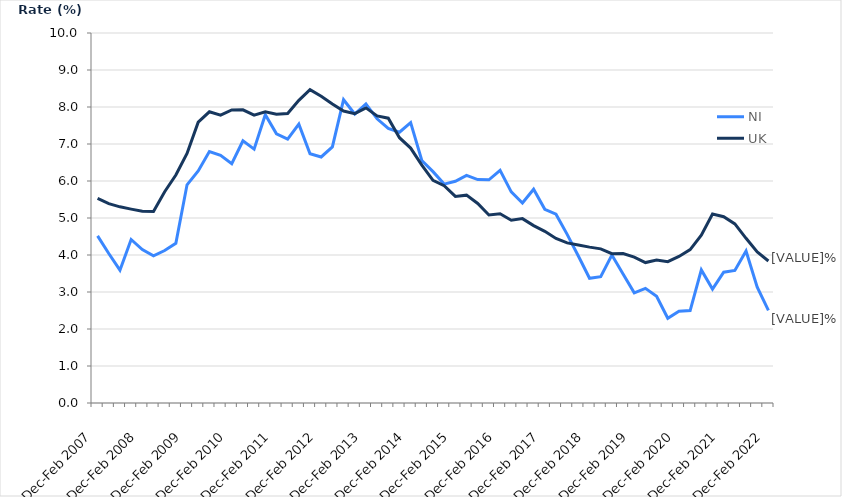
| Category | NI | UK |
|---|---|---|
| Dec-Feb 2007 | 4.516 | 5.53 |
| Mar-May 2007 | 4.04 | 5.389 |
| Jun-Aug 2007 | 3.589 | 5.302 |
| Sep-Nov 2007 | 4.419 | 5.239 |
| Dec-Feb 2008 | 4.146 | 5.181 |
| Mar-May 2008 | 3.979 | 5.179 |
| Jun-Aug 2008 | 4.122 | 5.71 |
| Sep-Nov 2008 | 4.317 | 6.163 |
| Dec-Feb 2009 | 5.897 | 6.744 |
| Mar-May 2009 | 6.27 | 7.59 |
| Jun-Aug 2009 | 6.796 | 7.87 |
| Sep-Nov 2009 | 6.693 | 7.781 |
| Dec-Feb 2010 | 6.47 | 7.92 |
| Mar-May 2010 | 7.085 | 7.923 |
| Jun-Aug 2010 | 6.862 | 7.782 |
| Sep-Nov 2010 | 7.791 | 7.871 |
| Dec-Feb 2011 | 7.277 | 7.803 |
| Mar-May 2011 | 7.133 | 7.822 |
| Jun-Aug 2011 | 7.538 | 8.181 |
| Sep-Nov 2011 | 6.736 | 8.467 |
| Dec-Feb 2012 | 6.65 | 8.289 |
| Mar-May 2012 | 6.922 | 8.08 |
| Jun-Aug 2012 | 8.196 | 7.89 |
| Sep-Nov 2012 | 7.81 | 7.82 |
| Dec-Feb 2013 | 8.083 | 7.976 |
| Mar-May 2013 | 7.68 | 7.758 |
| Jun-Aug 2013 | 7.422 | 7.698 |
| Sep-Nov 2013 | 7.318 | 7.17 |
| Dec-Feb 2014 | 7.578 | 6.889 |
| Mar-May 2014 | 6.554 | 6.428 |
| Jun-Aug 2014 | 6.253 | 6.019 |
| Sep-Nov 2014 | 5.916 | 5.871 |
| Dec-Feb 2015 | 5.991 | 5.583 |
| Mar-May 2015 | 6.154 | 5.617 |
| Jun-Aug 2015 | 6.039 | 5.392 |
| Sep-Nov 2015 | 6.033 | 5.081 |
| Dec-Feb 2016 | 6.288 | 5.113 |
| Mar-May 2016 | 5.706 | 4.939 |
| Jun-Aug 2016 | 5.404 | 4.983 |
| Sep-Nov 2016 | 5.778 | 4.794 |
| Dec-Feb 2017 | 5.235 | 4.64 |
| Mar-May 2017 | 5.102 | 4.445 |
| Jun-Aug 2017 | 4.558 | 4.328 |
| Sep-Nov 2017 | 3.974 | 4.272 |
| Dec-Feb 2018 | 3.371 | 4.213 |
| Mar-May 2018 | 3.416 | 4.165 |
| Jun-Aug 2018 | 3.999 | 4.035 |
| Sep-Nov 2018 | 3.486 | 4.039 |
| Dec-Feb 2019 | 2.979 | 3.942 |
| Mar-May 2019 | 3.099 | 3.796 |
| Jun-Aug 2019 | 2.886 | 3.863 |
| Sep-Nov 2019 | 2.289 | 3.819 |
| Dec-Feb 2020 | 2.483 | 3.961 |
| Mar-May 2020 | 2.498 | 4.147 |
| Jun-Aug 2020 | 3.598 | 4.538 |
| Sep-Nov 2020 | 3.079 | 5.107 |
| Dec-Feb 2021 | 3.537 | 5.035 |
| Mar-May 2021 | 3.582 | 4.839 |
| Jun-Aug 2021 | 4.11 | 4.451 |
| Sep-Nov 2021 | 3.129 | 4.083 |
| Dec-Feb 2022 | 2.506 | 3.838 |